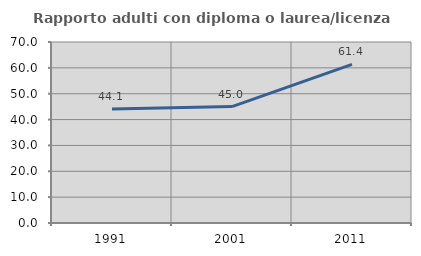
| Category | Rapporto adulti con diploma o laurea/licenza media  |
|---|---|
| 1991.0 | 44.079 |
| 2001.0 | 45.022 |
| 2011.0 | 61.351 |